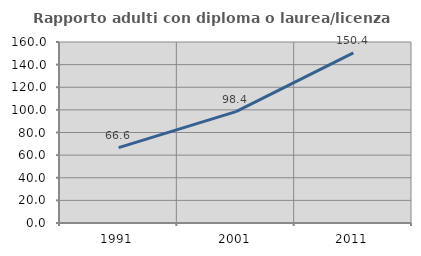
| Category | Rapporto adulti con diploma o laurea/licenza media  |
|---|---|
| 1991.0 | 66.583 |
| 2001.0 | 98.43 |
| 2011.0 | 150.444 |